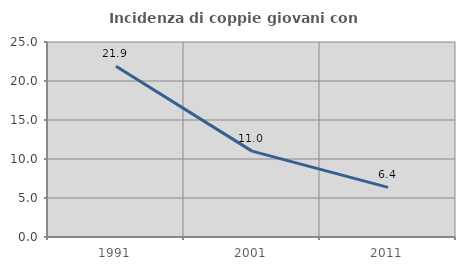
| Category | Incidenza di coppie giovani con figli |
|---|---|
| 1991.0 | 21.895 |
| 2001.0 | 11.009 |
| 2011.0 | 6.361 |